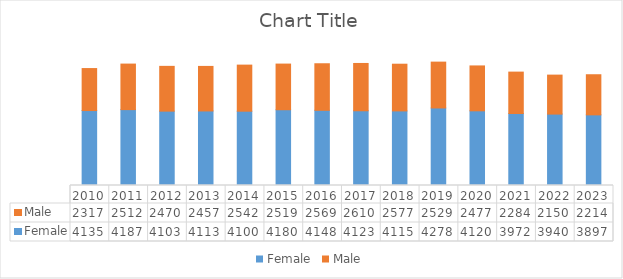
| Category | Female | Male |
|---|---|---|
| 2010 | 4135 | 2317 |
| 2011 | 4187 | 2512 |
| 2012 | 4103 | 2470 |
| 2013 | 4113 | 2457 |
| 2014 | 4100 | 2542 |
| 2015 | 4180 | 2519 |
| 2016 | 4148 | 2569 |
| 2017 | 4123 | 2610 |
| 2018 | 4115 | 2577 |
| 2019 | 4278 | 2529 |
| 2020 | 4120 | 2477 |
| 2021 | 3972 | 2284 |
| 2022 | 3940 | 2150 |
| 2023 | 3897 | 2214 |